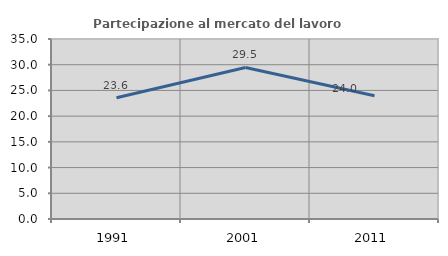
| Category | Partecipazione al mercato del lavoro  femminile |
|---|---|
| 1991.0 | 23.585 |
| 2001.0 | 29.474 |
| 2011.0 | 23.978 |